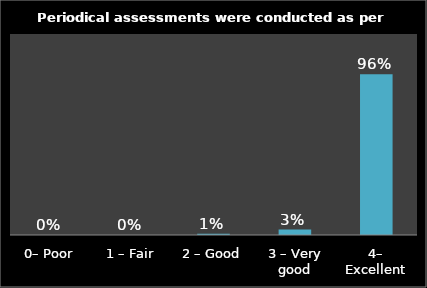
| Category | Series 0 |
|---|---|
| 0– Poor | 0 |
| 1 – Fair | 0 |
| 2 – Good | 0.008 |
| 3 – Very good | 0.033 |
| 4– Excellent | 0.96 |